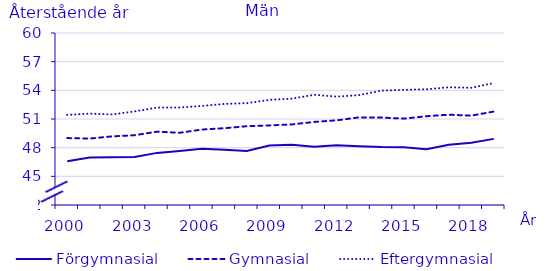
| Category | Förgymnasial | Gymnasial | Eftergymnasial |
|---|---|---|---|
| 2000.0 | 46.586 | 49.003 | 51.43 |
| 2001.0 | 46.977 | 48.953 | 51.567 |
| 2002.0 | 46.995 | 49.18 | 51.479 |
| 2003.0 | 47.018 | 49.302 | 51.794 |
| 2004.0 | 47.454 | 49.674 | 52.195 |
| 2005.0 | 47.656 | 49.557 | 52.202 |
| 2006.0 | 47.893 | 49.898 | 52.369 |
| 2007.0 | 47.79 | 50.037 | 52.577 |
| 2008.0 | 47.664 | 50.246 | 52.658 |
| 2009.0 | 48.231 | 50.328 | 53.005 |
| 2010.0 | 48.297 | 50.433 | 53.127 |
| 2011.0 | 48.107 | 50.692 | 53.534 |
| 2012.0 | 48.25 | 50.86 | 53.34 |
| 2013.0 | 48.14 | 51.17 | 53.5 |
| 2014.0 | 48.06 | 51.15 | 53.97 |
| 2015.0 | 48.05 | 51.04 | 54.05 |
| 2016.0 | 47.84 | 51.29 | 54.11 |
| 2017.0 | 48.3 | 51.45 | 54.32 |
| 2018.0 | 48.51 | 51.35 | 54.27 |
| 2019.0 | 48.92 | 51.78 | 54.76 |